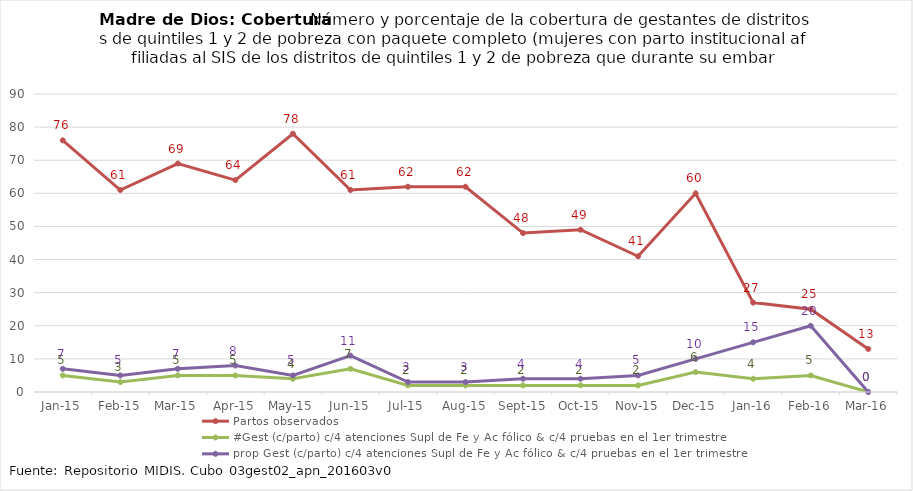
| Category | Partos observados | #Gest (c/parto) c/4 atenciones Supl de Fe y Ac fólico & c/4 pruebas en el 1er trimestre | prop Gest (c/parto) c/4 atenciones Supl de Fe y Ac fólico & c/4 pruebas en el 1er trimestre |
|---|---|---|---|
| 2015-01-01 | 76 | 5 | 7 |
| 2015-02-01 | 61 | 3 | 5 |
| 2015-03-01 | 69 | 5 | 7 |
| 2015-04-01 | 64 | 5 | 8 |
| 2015-05-01 | 78 | 4 | 5 |
| 2015-06-01 | 61 | 7 | 11 |
| 2015-07-01 | 62 | 2 | 3 |
| 2015-08-01 | 62 | 2 | 3 |
| 2015-09-01 | 48 | 2 | 4 |
| 2015-10-01 | 49 | 2 | 4 |
| 2015-11-01 | 41 | 2 | 5 |
| 2015-12-01 | 60 | 6 | 10 |
| 2016-01-01 | 27 | 4 | 15 |
| 2016-02-01 | 25 | 5 | 20 |
| 2016-03-01 | 13 | 0 | 0 |